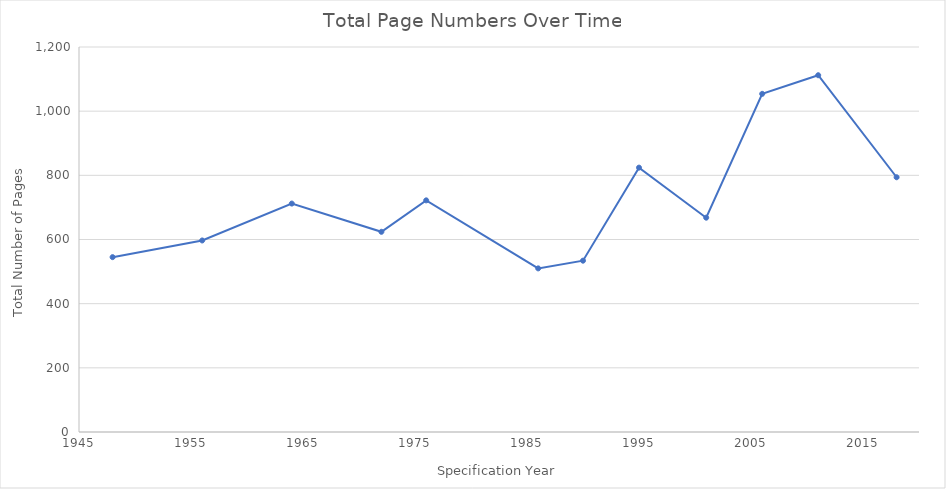
| Category | Series 0 |
|---|---|
| 1948.0 | 545 |
| 1956.0 | 597 |
| 1964.0 | 712 |
| 1972.0 | 624 |
| 1976.0 | 722 |
| 1986.0 | 510 |
| 1990.0 | 534 |
| 1995.0 | 824 |
| 2001.0 | 668 |
| 2006.0 | 1054 |
| 2011.0 | 1112 |
| 2018.0 | 794 |